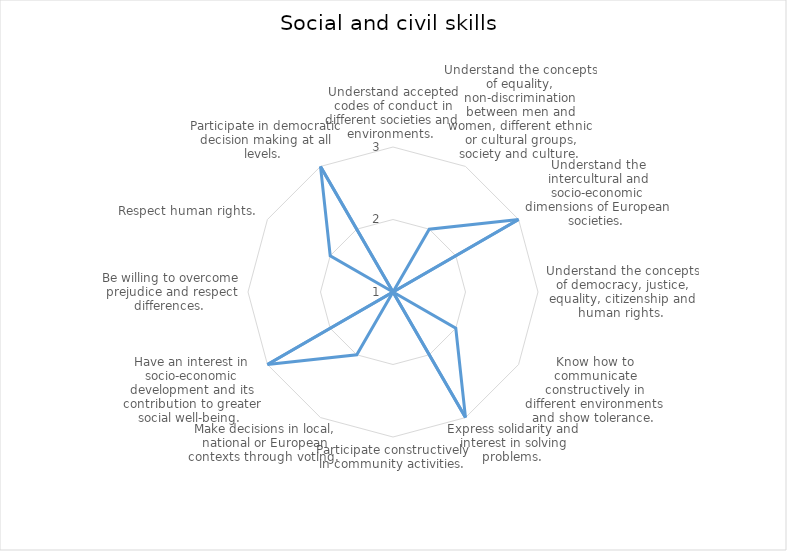
| Category | Series 0 |
|---|---|
| Understand accepted codes of conduct in different societies and environments.  | 1 |
| Understand the concepts of equality, non-discrimination between men and women, different ethnic or cultural groups, society and culture.  | 2 |
| Understand the intercultural and socio-economic dimensions of European societies.  | 3 |
| Understand the concepts of democracy, justice, equality, citizenship and human rights.  | 1 |
| Know how to communicate constructively in different environments and show tolerance.  | 2 |
| Express solidarity and interest in solving problems.  | 3 |
| Participate constructively in community activities.  | 1 |
| Make decisions in local, national or European contexts through voting.  | 2 |
| Have an interest in socio-economic development and its contribution to greater social well-being.  | 3 |
| Be willing to overcome prejudice and respect differences.  | 1 |
| Respect human rights.  | 2 |
| Participate in democratic decision making at all levels.  | 3 |